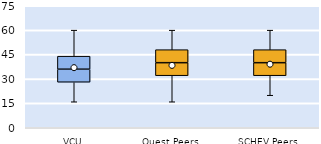
| Category | 25th | 50th | 75th |
|---|---|---|---|
| VCU | 28 | 8 | 8 |
| Quest Peers | 32 | 8 | 8 |
| SCHEV Peers | 32 | 8 | 8 |